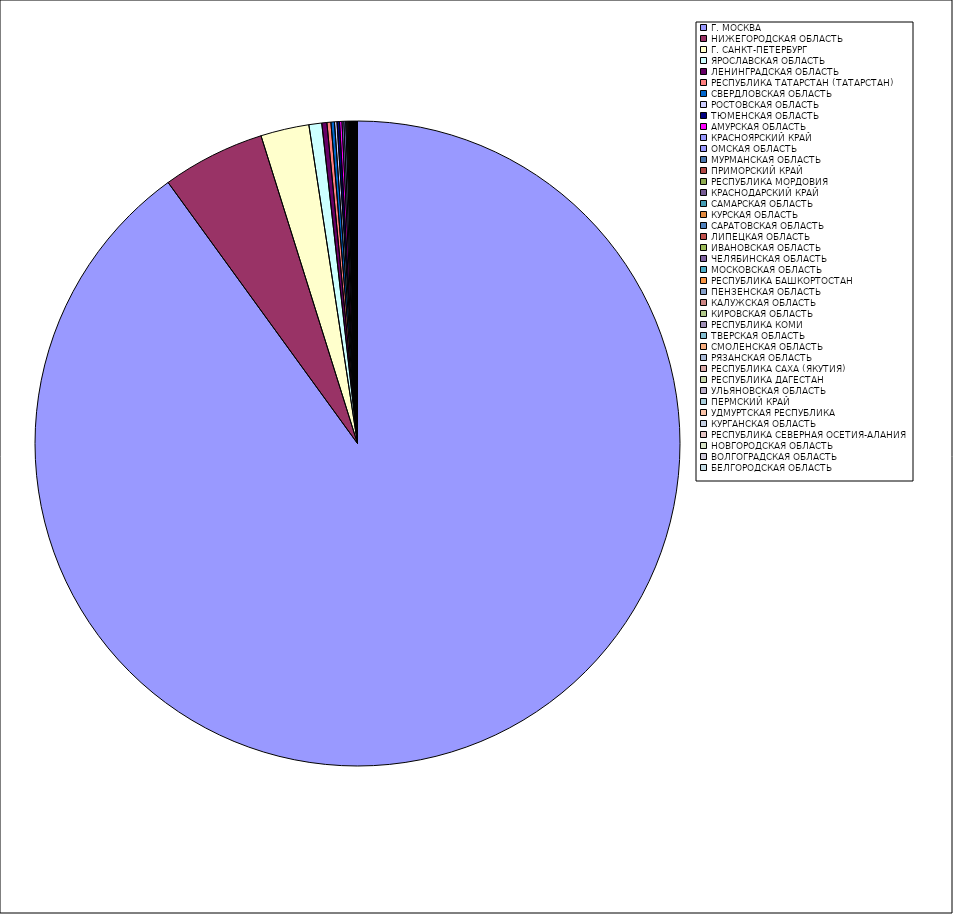
| Category | Оборот |
|---|---|
| Г. МОСКВА | 89.973 |
| НИЖЕГОРОДСКАЯ ОБЛАСТЬ | 5.153 |
| Г. САНКТ-ПЕТЕРБУРГ | 2.423 |
| ЯРОСЛАВСКАЯ ОБЛАСТЬ | 0.641 |
| ЛЕНИНГРАДСКАЯ ОБЛАСТЬ | 0.256 |
| РЕСПУБЛИКА ТАТАРСТАН (ТАТАРСТАН) | 0.199 |
| СВЕРДЛОВСКАЯ ОБЛАСТЬ | 0.175 |
| РОСТОВСКАЯ ОБЛАСТЬ | 0.126 |
| ТЮМЕНСКАЯ ОБЛАСТЬ | 0.125 |
| АМУРСКАЯ ОБЛАСТЬ | 0.123 |
| КРАСНОЯРСКИЙ КРАЙ | 0.092 |
| ОМСКАЯ ОБЛАСТЬ | 0.09 |
| МУРМАНСКАЯ ОБЛАСТЬ | 0.056 |
| ПРИМОРСКИЙ КРАЙ | 0.054 |
| РЕСПУБЛИКА МОРДОВИЯ | 0.042 |
| КРАСНОДАРСКИЙ КРАЙ | 0.041 |
| САМАРСКАЯ ОБЛАСТЬ | 0.03 |
| КУРСКАЯ ОБЛАСТЬ | 0.027 |
| САРАТОВСКАЯ ОБЛАСТЬ | 0.026 |
| ЛИПЕЦКАЯ ОБЛАСТЬ | 0.025 |
| ИВАНОВСКАЯ ОБЛАСТЬ | 0.023 |
| ЧЕЛЯБИНСКАЯ ОБЛАСТЬ | 0.022 |
| МОСКОВСКАЯ ОБЛАСТЬ | 0.021 |
| РЕСПУБЛИКА БАШКОРТОСТАН | 0.02 |
| ПЕНЗЕНСКАЯ ОБЛАСТЬ | 0.019 |
| КАЛУЖСКАЯ ОБЛАСТЬ | 0.019 |
| КИРОВСКАЯ ОБЛАСТЬ | 0.018 |
| РЕСПУБЛИКА КОМИ | 0.018 |
| ТВЕРСКАЯ ОБЛАСТЬ | 0.018 |
| СМОЛЕНСКАЯ ОБЛАСТЬ | 0.016 |
| РЯЗАНСКАЯ ОБЛАСТЬ | 0.013 |
| РЕСПУБЛИКА САХА (ЯКУТИЯ) | 0.012 |
| РЕСПУБЛИКА ДАГЕСТАН | 0.009 |
| УЛЬЯНОВСКАЯ ОБЛАСТЬ | 0.009 |
| ПЕРМСКИЙ КРАЙ | 0.009 |
| УДМУРТСКАЯ РЕСПУБЛИКА | 0.009 |
| КУРГАНСКАЯ ОБЛАСТЬ | 0.007 |
| РЕСПУБЛИКА СЕВЕРНАЯ ОСЕТИЯ-АЛАНИЯ | 0.006 |
| НОВГОРОДСКАЯ ОБЛАСТЬ | 0.005 |
| ВОЛГОГРАДСКАЯ ОБЛАСТЬ | 0.005 |
| БЕЛГОРОДСКАЯ ОБЛАСТЬ | 0.005 |